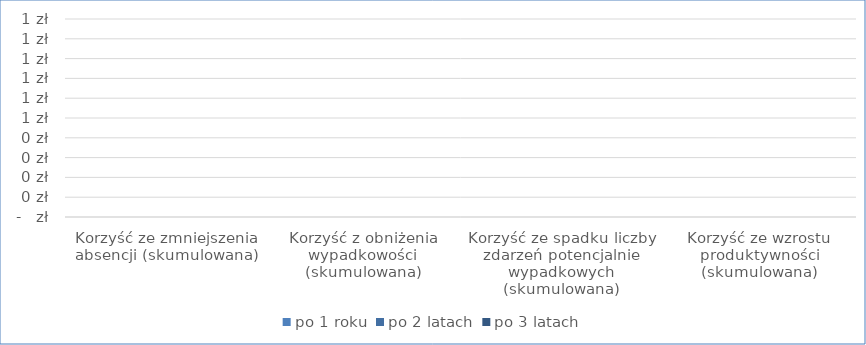
| Category | po 1 roku | po 2 latach | po 3 latach |
|---|---|---|---|
| Korzyść ze zmniejszenia absencji (skumulowana) | 0 | 0 | 0 |
| Korzyść z obniżenia wypadkowości (skumulowana) | 0 | 0 | 0 |
| Korzyść ze spadku liczby zdarzeń potencjalnie wypadkowych (skumulowana) | 0 | 0 | 0 |
| Korzyść ze wzrostu produktywności (skumulowana) | 0 | 0 | 0 |